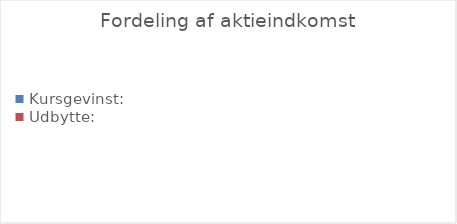
| Category | Series 0 |
|---|---|
| Kursgevinst: | 0 |
| Udbytte: | 0 |